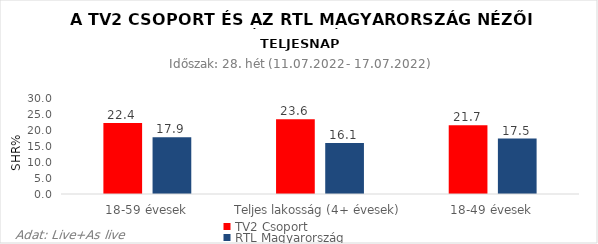
| Category | TV2 Csoport | RTL Magyarország |
|---|---|---|
| 18-59 évesek | 22.4 | 17.9 |
| Teljes lakosság (4+ évesek) | 23.6 | 16.1 |
| 18-49 évesek | 21.7 | 17.5 |